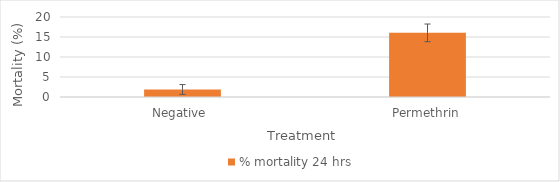
| Category | % mortality 24 hrs |
|---|---|
| Negative  | 1.887 |
| Permethrin | 16.038 |